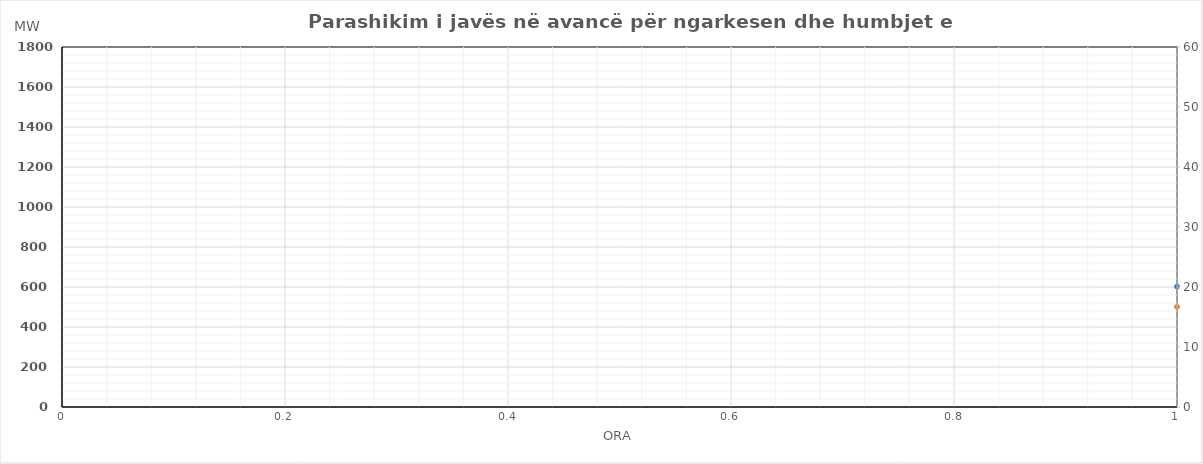
| Category | Ngarkesa (MWh) |
|---|---|
| 0 | 500.66 |
| 1 | 442.28 |
| 2 | 418.8 |
| 3 | 422.3 |
| 4 | 421.14 |
| 5 | 496.54 |
| 6 | 876.33 |
| 7 | 1133 |
| 8 | 1203.31 |
| 9 | 1154.44 |
| 10 | 922.87 |
| 11 | 1227.64 |
| 12 | 1215.09 |
| 13 | 1250.51 |
| 14 | 1352.43 |
| 15 | 1367.99 |
| 16 | 1569.17 |
| 17 | 1583.2 |
| 18 | 1588.96 |
| 19 | 1576.48 |
| 20 | 1385.41 |
| 21 | 1322.21 |
| 22 | 1218.51 |
| 23 | 1045.88 |
| 24 | 576.99 |
| 25 | 495.34 |
| 26 | 471.36 |
| 27 | 469.9 |
| 28 | 476.9 |
| 29 | 609.48 |
| 30 | 1009.38 |
| 31 | 1214.86 |
| 32 | 1267.25 |
| 33 | 1244.18 |
| 34 | 1207.44 |
| 35 | 1297.21 |
| 36 | 1287.76 |
| 37 | 1315.84 |
| 38 | 1339.48 |
| 39 | 1343.77 |
| 40 | 1412.69 |
| 41 | 1521.03 |
| 42 | 1511.58 |
| 43 | 1487.85 |
| 44 | 1442.65 |
| 45 | 1333.09 |
| 46 | 954.1 |
| 47 | 804.53 |
| 48 | 451.4 |
| 49 | 398 |
| 50 | 392 |
| 51 | 395.5 |
| 52 | 396.8 |
| 53 | 454.22 |
| 54 | 630.17 |
| 55 | 937.32 |
| 56 | 1021.05 |
| 57 | 995.03 |
| 58 | 994.03 |
| 59 | 996.29 |
| 60 | 889.26 |
| 61 | 910.22 |
| 62 | 1044.44 |
| 63 | 1065.77 |
| 64 | 1138.62 |
| 65 | 1212.44 |
| 66 | 1210.28 |
| 67 | 1184.82 |
| 68 | 1147.19 |
| 69 | 1054.16 |
| 70 | 769.33 |
| 71 | 595.37 |
| 72 | 486.87 |
| 73 | 412.2 |
| 74 | 397 |
| 75 | 399 |
| 76 | 399 |
| 77 | 463.4 |
| 78 | 810.39 |
| 79 | 999.68 |
| 80 | 1099.76 |
| 81 | 1125.34 |
| 82 | 1112.62 |
| 83 | 937.84 |
| 84 | 926.92 |
| 85 | 982.58 |
| 86 | 993.78 |
| 87 | 1138.9 |
| 88 | 1173.76 |
| 89 | 1254.96 |
| 90 | 1250.99 |
| 91 | 1228.94 |
| 92 | 1186.92 |
| 93 | 877.5 |
| 94 | 749.63 |
| 95 | 616.1 |
| 96 | 519.3 |
| 97 | 430.65 |
| 98 | 415 |
| 99 | 413 |
| 100 | 409 |
| 101 | 455.51 |
| 102 | 433.31 |
| 103 | 591.83 |
| 104 | 780.37 |
| 105 | 905.57 |
| 106 | 913.85 |
| 107 | 911.9 |
| 108 | 843.37 |
| 109 | 872.34 |
| 110 | 904.88 |
| 111 | 904.57 |
| 112 | 1050.9 |
| 113 | 1183.85 |
| 114 | 1161.81 |
| 115 | 1180.49 |
| 116 | 965.3 |
| 117 | 871.21 |
| 118 | 759.47 |
| 119 | 591.53 |
| 120 | 538.86 |
| 121 | 479.3 |
| 122 | 418.3 |
| 123 | 413.5 |
| 124 | 410.24 |
| 125 | 437.54 |
| 126 | 442.53 |
| 127 | 593.3 |
| 128 | 784.81 |
| 129 | 869.21 |
| 130 | 876.65 |
| 131 | 790.73 |
| 132 | 799.41 |
| 133 | 778.13 |
| 134 | 791.21 |
| 135 | 866.32 |
| 136 | 989.4 |
| 137 | 1128.97 |
| 138 | 1125.6 |
| 139 | 1102.13 |
| 140 | 987.16 |
| 141 | 882.19 |
| 142 | 757.61 |
| 143 | 629.78 |
| 144 | 486.87 |
| 145 | 412.2 |
| 146 | 397 |
| 147 | 399 |
| 148 | 399 |
| 149 | 463.4 |
| 150 | 810.39 |
| 151 | 999.68 |
| 152 | 1099.76 |
| 153 | 1125.34 |
| 154 | 1112.62 |
| 155 | 937.84 |
| 156 | 926.92 |
| 157 | 982.58 |
| 158 | 993.78 |
| 159 | 1138.9 |
| 160 | 1173.76 |
| 161 | 1254.96 |
| 162 | 1250.99 |
| 163 | 1228.94 |
| 164 | 1186.92 |
| 165 | 877.5 |
| 166 | 749.63 |
| 167 | 616.1 |